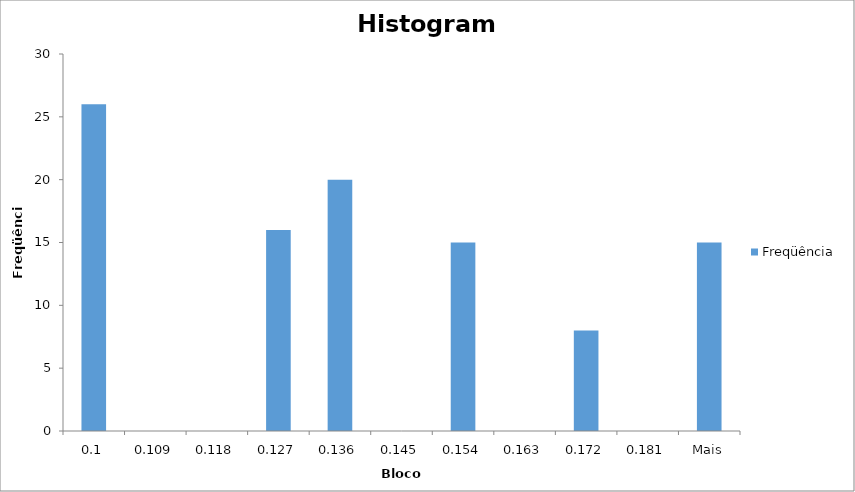
| Category | Freqüência |
|---|---|
| 0,1 | 26 |
| 0,109 | 0 |
| 0,118 | 0 |
| 0,127 | 16 |
| 0,136 | 20 |
| 0,145 | 0 |
| 0,154 | 15 |
| 0,163 | 0 |
| 0,172 | 8 |
| 0,181 | 0 |
| Mais | 15 |